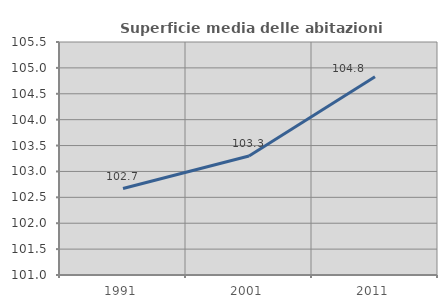
| Category | Superficie media delle abitazioni occupate |
|---|---|
| 1991.0 | 102.67 |
| 2001.0 | 103.299 |
| 2011.0 | 104.827 |